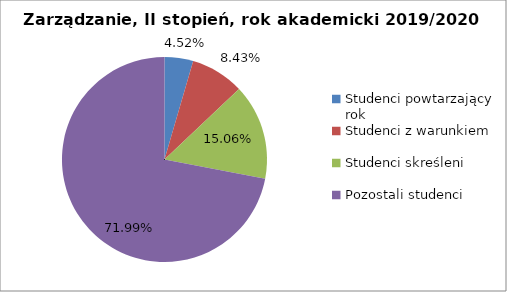
| Category | Series 0 |
|---|---|
| Studenci powtarzający rok | 15 |
| Studenci z warunkiem | 28 |
| Studenci skreśleni | 50 |
| Pozostali studenci | 239 |